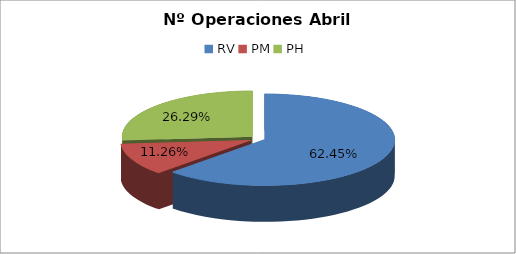
| Category | Series 0 |
|---|---|
| RV | 19824 |
| PM | 3575 |
| PH | 8345 |